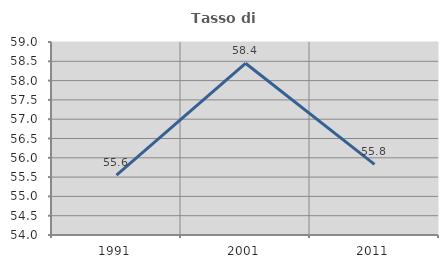
| Category | Tasso di occupazione   |
|---|---|
| 1991.0 | 55.551 |
| 2001.0 | 58.448 |
| 2011.0 | 55.829 |